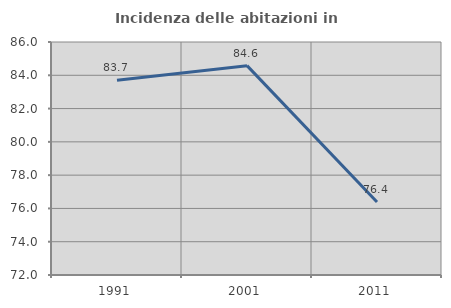
| Category | Incidenza delle abitazioni in proprietà  |
|---|---|
| 1991.0 | 83.705 |
| 2001.0 | 84.579 |
| 2011.0 | 76.382 |